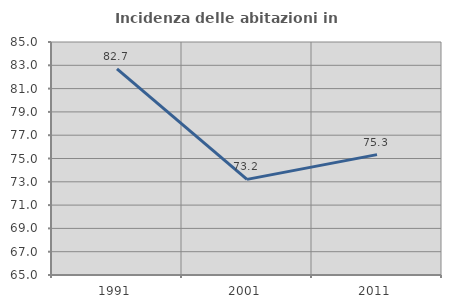
| Category | Incidenza delle abitazioni in proprietà  |
|---|---|
| 1991.0 | 82.702 |
| 2001.0 | 73.209 |
| 2011.0 | 75.333 |